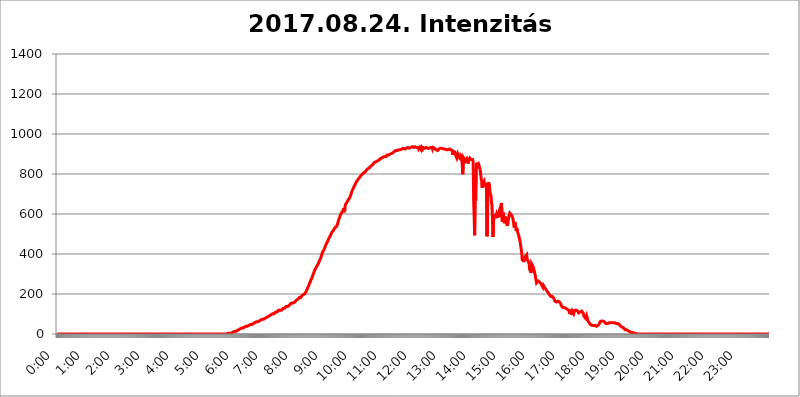
| Category | 2017.08.24. Intenzitás [W/m^2] |
|---|---|
| 0.0 | 0 |
| 0.0006944444444444445 | 0 |
| 0.001388888888888889 | 0 |
| 0.0020833333333333333 | 0 |
| 0.002777777777777778 | 0 |
| 0.003472222222222222 | 0 |
| 0.004166666666666667 | 0 |
| 0.004861111111111111 | 0 |
| 0.005555555555555556 | 0 |
| 0.0062499999999999995 | 0 |
| 0.006944444444444444 | 0 |
| 0.007638888888888889 | 0 |
| 0.008333333333333333 | 0 |
| 0.009027777777777779 | 0 |
| 0.009722222222222222 | 0 |
| 0.010416666666666666 | 0 |
| 0.011111111111111112 | 0 |
| 0.011805555555555555 | 0 |
| 0.012499999999999999 | 0 |
| 0.013194444444444444 | 0 |
| 0.013888888888888888 | 0 |
| 0.014583333333333332 | 0 |
| 0.015277777777777777 | 0 |
| 0.015972222222222224 | 0 |
| 0.016666666666666666 | 0 |
| 0.017361111111111112 | 0 |
| 0.018055555555555557 | 0 |
| 0.01875 | 0 |
| 0.019444444444444445 | 0 |
| 0.02013888888888889 | 0 |
| 0.020833333333333332 | 0 |
| 0.02152777777777778 | 0 |
| 0.022222222222222223 | 0 |
| 0.02291666666666667 | 0 |
| 0.02361111111111111 | 0 |
| 0.024305555555555556 | 0 |
| 0.024999999999999998 | 0 |
| 0.025694444444444447 | 0 |
| 0.02638888888888889 | 0 |
| 0.027083333333333334 | 0 |
| 0.027777777777777776 | 0 |
| 0.02847222222222222 | 0 |
| 0.029166666666666664 | 0 |
| 0.029861111111111113 | 0 |
| 0.030555555555555555 | 0 |
| 0.03125 | 0 |
| 0.03194444444444445 | 0 |
| 0.03263888888888889 | 0 |
| 0.03333333333333333 | 0 |
| 0.034027777777777775 | 0 |
| 0.034722222222222224 | 0 |
| 0.035416666666666666 | 0 |
| 0.036111111111111115 | 0 |
| 0.03680555555555556 | 0 |
| 0.0375 | 0 |
| 0.03819444444444444 | 0 |
| 0.03888888888888889 | 0 |
| 0.03958333333333333 | 0 |
| 0.04027777777777778 | 0 |
| 0.04097222222222222 | 0 |
| 0.041666666666666664 | 0 |
| 0.042361111111111106 | 0 |
| 0.04305555555555556 | 0 |
| 0.043750000000000004 | 0 |
| 0.044444444444444446 | 0 |
| 0.04513888888888889 | 0 |
| 0.04583333333333334 | 0 |
| 0.04652777777777778 | 0 |
| 0.04722222222222222 | 0 |
| 0.04791666666666666 | 0 |
| 0.04861111111111111 | 0 |
| 0.049305555555555554 | 0 |
| 0.049999999999999996 | 0 |
| 0.05069444444444445 | 0 |
| 0.051388888888888894 | 0 |
| 0.052083333333333336 | 0 |
| 0.05277777777777778 | 0 |
| 0.05347222222222222 | 0 |
| 0.05416666666666667 | 0 |
| 0.05486111111111111 | 0 |
| 0.05555555555555555 | 0 |
| 0.05625 | 0 |
| 0.05694444444444444 | 0 |
| 0.057638888888888885 | 0 |
| 0.05833333333333333 | 0 |
| 0.05902777777777778 | 0 |
| 0.059722222222222225 | 0 |
| 0.06041666666666667 | 0 |
| 0.061111111111111116 | 0 |
| 0.06180555555555556 | 0 |
| 0.0625 | 0 |
| 0.06319444444444444 | 0 |
| 0.06388888888888888 | 0 |
| 0.06458333333333334 | 0 |
| 0.06527777777777778 | 0 |
| 0.06597222222222222 | 0 |
| 0.06666666666666667 | 0 |
| 0.06736111111111111 | 0 |
| 0.06805555555555555 | 0 |
| 0.06874999999999999 | 0 |
| 0.06944444444444443 | 0 |
| 0.07013888888888889 | 0 |
| 0.07083333333333333 | 0 |
| 0.07152777777777779 | 0 |
| 0.07222222222222223 | 0 |
| 0.07291666666666667 | 0 |
| 0.07361111111111111 | 0 |
| 0.07430555555555556 | 0 |
| 0.075 | 0 |
| 0.07569444444444444 | 0 |
| 0.0763888888888889 | 0 |
| 0.07708333333333334 | 0 |
| 0.07777777777777778 | 0 |
| 0.07847222222222222 | 0 |
| 0.07916666666666666 | 0 |
| 0.0798611111111111 | 0 |
| 0.08055555555555556 | 0 |
| 0.08125 | 0 |
| 0.08194444444444444 | 0 |
| 0.08263888888888889 | 0 |
| 0.08333333333333333 | 0 |
| 0.08402777777777777 | 0 |
| 0.08472222222222221 | 0 |
| 0.08541666666666665 | 0 |
| 0.08611111111111112 | 0 |
| 0.08680555555555557 | 0 |
| 0.08750000000000001 | 0 |
| 0.08819444444444445 | 0 |
| 0.08888888888888889 | 0 |
| 0.08958333333333333 | 0 |
| 0.09027777777777778 | 0 |
| 0.09097222222222222 | 0 |
| 0.09166666666666667 | 0 |
| 0.09236111111111112 | 0 |
| 0.09305555555555556 | 0 |
| 0.09375 | 0 |
| 0.09444444444444444 | 0 |
| 0.09513888888888888 | 0 |
| 0.09583333333333333 | 0 |
| 0.09652777777777777 | 0 |
| 0.09722222222222222 | 0 |
| 0.09791666666666667 | 0 |
| 0.09861111111111111 | 0 |
| 0.09930555555555555 | 0 |
| 0.09999999999999999 | 0 |
| 0.10069444444444443 | 0 |
| 0.1013888888888889 | 0 |
| 0.10208333333333335 | 0 |
| 0.10277777777777779 | 0 |
| 0.10347222222222223 | 0 |
| 0.10416666666666667 | 0 |
| 0.10486111111111111 | 0 |
| 0.10555555555555556 | 0 |
| 0.10625 | 0 |
| 0.10694444444444444 | 0 |
| 0.1076388888888889 | 0 |
| 0.10833333333333334 | 0 |
| 0.10902777777777778 | 0 |
| 0.10972222222222222 | 0 |
| 0.1111111111111111 | 0 |
| 0.11180555555555556 | 0 |
| 0.11180555555555556 | 0 |
| 0.1125 | 0 |
| 0.11319444444444444 | 0 |
| 0.11388888888888889 | 0 |
| 0.11458333333333333 | 0 |
| 0.11527777777777777 | 0 |
| 0.11597222222222221 | 0 |
| 0.11666666666666665 | 0 |
| 0.1173611111111111 | 0 |
| 0.11805555555555557 | 0 |
| 0.11944444444444445 | 0 |
| 0.12013888888888889 | 0 |
| 0.12083333333333333 | 0 |
| 0.12152777777777778 | 0 |
| 0.12222222222222223 | 0 |
| 0.12291666666666667 | 0 |
| 0.12291666666666667 | 0 |
| 0.12361111111111112 | 0 |
| 0.12430555555555556 | 0 |
| 0.125 | 0 |
| 0.12569444444444444 | 0 |
| 0.12638888888888888 | 0 |
| 0.12708333333333333 | 0 |
| 0.16875 | 0 |
| 0.12847222222222224 | 0 |
| 0.12916666666666668 | 0 |
| 0.12986111111111112 | 0 |
| 0.13055555555555556 | 0 |
| 0.13125 | 0 |
| 0.13194444444444445 | 0 |
| 0.1326388888888889 | 0 |
| 0.13333333333333333 | 0 |
| 0.13402777777777777 | 0 |
| 0.13402777777777777 | 0 |
| 0.13472222222222222 | 0 |
| 0.13541666666666666 | 0 |
| 0.1361111111111111 | 0 |
| 0.13749999999999998 | 0 |
| 0.13819444444444443 | 0 |
| 0.1388888888888889 | 0 |
| 0.13958333333333334 | 0 |
| 0.14027777777777778 | 0 |
| 0.14097222222222222 | 0 |
| 0.14166666666666666 | 0 |
| 0.1423611111111111 | 0 |
| 0.14305555555555557 | 0 |
| 0.14375000000000002 | 0 |
| 0.14444444444444446 | 0 |
| 0.1451388888888889 | 0 |
| 0.1451388888888889 | 0 |
| 0.14652777777777778 | 0 |
| 0.14722222222222223 | 0 |
| 0.14791666666666667 | 0 |
| 0.1486111111111111 | 0 |
| 0.14930555555555555 | 0 |
| 0.15 | 0 |
| 0.15069444444444444 | 0 |
| 0.15138888888888888 | 0 |
| 0.15208333333333332 | 0 |
| 0.15277777777777776 | 0 |
| 0.15347222222222223 | 0 |
| 0.15416666666666667 | 0 |
| 0.15486111111111112 | 0 |
| 0.15555555555555556 | 0 |
| 0.15625 | 0 |
| 0.15694444444444444 | 0 |
| 0.15763888888888888 | 0 |
| 0.15833333333333333 | 0 |
| 0.15902777777777777 | 0 |
| 0.15972222222222224 | 0 |
| 0.16041666666666668 | 0 |
| 0.16111111111111112 | 0 |
| 0.16180555555555556 | 0 |
| 0.1625 | 0 |
| 0.16319444444444445 | 0 |
| 0.1638888888888889 | 0 |
| 0.16458333333333333 | 0 |
| 0.16527777777777777 | 0 |
| 0.16597222222222222 | 0 |
| 0.16666666666666666 | 0 |
| 0.1673611111111111 | 0 |
| 0.16805555555555554 | 0 |
| 0.16874999999999998 | 0 |
| 0.16944444444444443 | 0 |
| 0.17013888888888887 | 0 |
| 0.1708333333333333 | 0 |
| 0.17152777777777775 | 0 |
| 0.17222222222222225 | 0 |
| 0.1729166666666667 | 0 |
| 0.17361111111111113 | 0 |
| 0.17430555555555557 | 0 |
| 0.17500000000000002 | 0 |
| 0.17569444444444446 | 0 |
| 0.1763888888888889 | 0 |
| 0.17708333333333334 | 0 |
| 0.17777777777777778 | 0 |
| 0.17847222222222223 | 0 |
| 0.17916666666666667 | 0 |
| 0.1798611111111111 | 0 |
| 0.18055555555555555 | 0 |
| 0.18125 | 0 |
| 0.18194444444444444 | 0 |
| 0.1826388888888889 | 0 |
| 0.18333333333333335 | 0 |
| 0.1840277777777778 | 0 |
| 0.18472222222222223 | 0 |
| 0.18541666666666667 | 0 |
| 0.18611111111111112 | 0 |
| 0.18680555555555556 | 0 |
| 0.1875 | 0 |
| 0.18819444444444444 | 0 |
| 0.18888888888888888 | 0 |
| 0.18958333333333333 | 0 |
| 0.19027777777777777 | 0 |
| 0.1909722222222222 | 0 |
| 0.19166666666666665 | 0 |
| 0.19236111111111112 | 0 |
| 0.19305555555555554 | 0 |
| 0.19375 | 0 |
| 0.19444444444444445 | 0 |
| 0.1951388888888889 | 0 |
| 0.19583333333333333 | 0 |
| 0.19652777777777777 | 0 |
| 0.19722222222222222 | 0 |
| 0.19791666666666666 | 0 |
| 0.1986111111111111 | 0 |
| 0.19930555555555554 | 0 |
| 0.19999999999999998 | 0 |
| 0.20069444444444443 | 0 |
| 0.20138888888888887 | 0 |
| 0.2020833333333333 | 0 |
| 0.2027777777777778 | 0 |
| 0.2034722222222222 | 0 |
| 0.2041666666666667 | 0 |
| 0.20486111111111113 | 0 |
| 0.20555555555555557 | 0 |
| 0.20625000000000002 | 0 |
| 0.20694444444444446 | 0 |
| 0.2076388888888889 | 0 |
| 0.20833333333333334 | 0 |
| 0.20902777777777778 | 0 |
| 0.20972222222222223 | 0 |
| 0.21041666666666667 | 0 |
| 0.2111111111111111 | 0 |
| 0.21180555555555555 | 0 |
| 0.2125 | 0 |
| 0.21319444444444444 | 0 |
| 0.2138888888888889 | 0 |
| 0.21458333333333335 | 0 |
| 0.2152777777777778 | 0 |
| 0.21597222222222223 | 0 |
| 0.21666666666666667 | 0 |
| 0.21736111111111112 | 0 |
| 0.21805555555555556 | 0 |
| 0.21875 | 0 |
| 0.21944444444444444 | 0 |
| 0.22013888888888888 | 0 |
| 0.22083333333333333 | 0 |
| 0.22152777777777777 | 0 |
| 0.2222222222222222 | 0 |
| 0.22291666666666665 | 0 |
| 0.2236111111111111 | 0 |
| 0.22430555555555556 | 0 |
| 0.225 | 0 |
| 0.22569444444444445 | 0 |
| 0.2263888888888889 | 0 |
| 0.22708333333333333 | 0 |
| 0.22777777777777777 | 0 |
| 0.22847222222222222 | 0 |
| 0.22916666666666666 | 0 |
| 0.2298611111111111 | 0 |
| 0.23055555555555554 | 0 |
| 0.23124999999999998 | 0 |
| 0.23194444444444443 | 0 |
| 0.23263888888888887 | 0 |
| 0.2333333333333333 | 0 |
| 0.2340277777777778 | 0 |
| 0.2347222222222222 | 0 |
| 0.2354166666666667 | 0 |
| 0.23611111111111113 | 0 |
| 0.23680555555555557 | 0 |
| 0.23750000000000002 | 0 |
| 0.23819444444444446 | 0 |
| 0.2388888888888889 | 0 |
| 0.23958333333333334 | 3.525 |
| 0.24027777777777778 | 3.525 |
| 0.24097222222222223 | 3.525 |
| 0.24166666666666667 | 3.525 |
| 0.2423611111111111 | 3.525 |
| 0.24305555555555555 | 3.525 |
| 0.24375 | 3.525 |
| 0.24444444444444446 | 3.525 |
| 0.24513888888888888 | 7.887 |
| 0.24583333333333335 | 7.887 |
| 0.2465277777777778 | 7.887 |
| 0.24722222222222223 | 7.887 |
| 0.24791666666666667 | 12.257 |
| 0.24861111111111112 | 12.257 |
| 0.24930555555555556 | 12.257 |
| 0.25 | 12.257 |
| 0.25069444444444444 | 12.257 |
| 0.2513888888888889 | 16.636 |
| 0.2520833333333333 | 16.636 |
| 0.25277777777777777 | 16.636 |
| 0.2534722222222222 | 16.636 |
| 0.25416666666666665 | 21.024 |
| 0.2548611111111111 | 21.024 |
| 0.2555555555555556 | 21.024 |
| 0.25625000000000003 | 25.419 |
| 0.2569444444444445 | 25.419 |
| 0.2576388888888889 | 25.419 |
| 0.25833333333333336 | 29.823 |
| 0.2590277777777778 | 29.823 |
| 0.25972222222222224 | 29.823 |
| 0.2604166666666667 | 29.823 |
| 0.2611111111111111 | 29.823 |
| 0.26180555555555557 | 34.234 |
| 0.2625 | 34.234 |
| 0.26319444444444445 | 34.234 |
| 0.2638888888888889 | 38.653 |
| 0.26458333333333334 | 38.653 |
| 0.2652777777777778 | 38.653 |
| 0.2659722222222222 | 38.653 |
| 0.26666666666666666 | 38.653 |
| 0.2673611111111111 | 43.079 |
| 0.26805555555555555 | 43.079 |
| 0.26875 | 43.079 |
| 0.26944444444444443 | 43.079 |
| 0.2701388888888889 | 47.511 |
| 0.2708333333333333 | 47.511 |
| 0.27152777777777776 | 47.511 |
| 0.2722222222222222 | 47.511 |
| 0.27291666666666664 | 47.511 |
| 0.2736111111111111 | 51.951 |
| 0.2743055555555555 | 51.951 |
| 0.27499999999999997 | 51.951 |
| 0.27569444444444446 | 56.398 |
| 0.27638888888888885 | 56.398 |
| 0.27708333333333335 | 56.398 |
| 0.2777777777777778 | 56.398 |
| 0.27847222222222223 | 60.85 |
| 0.2791666666666667 | 60.85 |
| 0.2798611111111111 | 60.85 |
| 0.28055555555555556 | 60.85 |
| 0.28125 | 60.85 |
| 0.28194444444444444 | 65.31 |
| 0.2826388888888889 | 65.31 |
| 0.2833333333333333 | 65.31 |
| 0.28402777777777777 | 65.31 |
| 0.2847222222222222 | 69.775 |
| 0.28541666666666665 | 69.775 |
| 0.28611111111111115 | 69.775 |
| 0.28680555555555554 | 69.775 |
| 0.28750000000000003 | 74.246 |
| 0.2881944444444445 | 74.246 |
| 0.2888888888888889 | 74.246 |
| 0.28958333333333336 | 74.246 |
| 0.2902777777777778 | 74.246 |
| 0.29097222222222224 | 78.722 |
| 0.2916666666666667 | 78.722 |
| 0.2923611111111111 | 83.205 |
| 0.29305555555555557 | 83.205 |
| 0.29375 | 83.205 |
| 0.29444444444444445 | 83.205 |
| 0.2951388888888889 | 83.205 |
| 0.29583333333333334 | 87.692 |
| 0.2965277777777778 | 87.692 |
| 0.2972222222222222 | 87.692 |
| 0.29791666666666666 | 92.184 |
| 0.2986111111111111 | 92.184 |
| 0.29930555555555555 | 92.184 |
| 0.3 | 96.682 |
| 0.30069444444444443 | 96.682 |
| 0.3013888888888889 | 96.682 |
| 0.3020833333333333 | 101.184 |
| 0.30277777777777776 | 101.184 |
| 0.3034722222222222 | 101.184 |
| 0.30416666666666664 | 101.184 |
| 0.3048611111111111 | 105.69 |
| 0.3055555555555555 | 105.69 |
| 0.30624999999999997 | 110.201 |
| 0.3069444444444444 | 110.201 |
| 0.3076388888888889 | 110.201 |
| 0.30833333333333335 | 110.201 |
| 0.3090277777777778 | 114.716 |
| 0.30972222222222223 | 114.716 |
| 0.3104166666666667 | 119.235 |
| 0.3111111111111111 | 119.235 |
| 0.31180555555555556 | 119.235 |
| 0.3125 | 119.235 |
| 0.31319444444444444 | 119.235 |
| 0.3138888888888889 | 119.235 |
| 0.3145833333333333 | 119.235 |
| 0.31527777777777777 | 123.758 |
| 0.3159722222222222 | 123.758 |
| 0.31666666666666665 | 128.284 |
| 0.31736111111111115 | 128.284 |
| 0.31805555555555554 | 128.284 |
| 0.31875000000000003 | 128.284 |
| 0.3194444444444445 | 128.284 |
| 0.3201388888888889 | 128.284 |
| 0.32083333333333336 | 137.347 |
| 0.3215277777777778 | 132.814 |
| 0.32222222222222224 | 137.347 |
| 0.3229166666666667 | 137.347 |
| 0.3236111111111111 | 141.884 |
| 0.32430555555555557 | 141.884 |
| 0.325 | 141.884 |
| 0.32569444444444445 | 146.423 |
| 0.3263888888888889 | 146.423 |
| 0.32708333333333334 | 150.964 |
| 0.3277777777777778 | 150.964 |
| 0.3284722222222222 | 155.509 |
| 0.32916666666666666 | 155.509 |
| 0.3298611111111111 | 155.509 |
| 0.33055555555555555 | 155.509 |
| 0.33125 | 155.509 |
| 0.33194444444444443 | 155.509 |
| 0.3326388888888889 | 155.509 |
| 0.3333333333333333 | 160.056 |
| 0.3340277777777778 | 164.605 |
| 0.3347222222222222 | 164.605 |
| 0.3354166666666667 | 169.156 |
| 0.3361111111111111 | 169.156 |
| 0.3368055555555556 | 173.709 |
| 0.33749999999999997 | 173.709 |
| 0.33819444444444446 | 178.264 |
| 0.33888888888888885 | 178.264 |
| 0.33958333333333335 | 182.82 |
| 0.34027777777777773 | 182.82 |
| 0.34097222222222223 | 182.82 |
| 0.3416666666666666 | 182.82 |
| 0.3423611111111111 | 187.378 |
| 0.3430555555555555 | 191.937 |
| 0.34375 | 191.937 |
| 0.3444444444444445 | 196.497 |
| 0.3451388888888889 | 196.497 |
| 0.3458333333333334 | 196.497 |
| 0.34652777777777777 | 196.497 |
| 0.34722222222222227 | 201.058 |
| 0.34791666666666665 | 201.058 |
| 0.34861111111111115 | 210.182 |
| 0.34930555555555554 | 214.746 |
| 0.35000000000000003 | 219.309 |
| 0.3506944444444444 | 223.873 |
| 0.3513888888888889 | 233 |
| 0.3520833333333333 | 237.564 |
| 0.3527777777777778 | 242.127 |
| 0.3534722222222222 | 251.251 |
| 0.3541666666666667 | 255.813 |
| 0.3548611111111111 | 260.373 |
| 0.35555555555555557 | 269.49 |
| 0.35625 | 274.047 |
| 0.35694444444444445 | 278.603 |
| 0.3576388888888889 | 283.156 |
| 0.35833333333333334 | 292.259 |
| 0.3590277777777778 | 296.808 |
| 0.3597222222222222 | 305.898 |
| 0.36041666666666666 | 310.44 |
| 0.3611111111111111 | 319.517 |
| 0.36180555555555555 | 319.517 |
| 0.3625 | 328.584 |
| 0.36319444444444443 | 333.113 |
| 0.3638888888888889 | 337.639 |
| 0.3645833333333333 | 337.639 |
| 0.3652777777777778 | 346.682 |
| 0.3659722222222222 | 351.198 |
| 0.3666666666666667 | 355.712 |
| 0.3673611111111111 | 360.221 |
| 0.3680555555555556 | 369.23 |
| 0.36874999999999997 | 373.729 |
| 0.36944444444444446 | 378.224 |
| 0.37013888888888885 | 387.202 |
| 0.37083333333333335 | 396.164 |
| 0.37152777777777773 | 400.638 |
| 0.37222222222222223 | 409.574 |
| 0.3729166666666666 | 405.108 |
| 0.3736111111111111 | 414.035 |
| 0.3743055555555555 | 422.943 |
| 0.375 | 427.39 |
| 0.3756944444444445 | 436.27 |
| 0.3763888888888889 | 440.702 |
| 0.3770833333333334 | 449.551 |
| 0.37777777777777777 | 453.968 |
| 0.37847222222222227 | 458.38 |
| 0.37916666666666665 | 462.786 |
| 0.37986111111111115 | 467.187 |
| 0.38055555555555554 | 475.972 |
| 0.38125000000000003 | 480.356 |
| 0.3819444444444444 | 484.735 |
| 0.3826388888888889 | 489.108 |
| 0.3833333333333333 | 493.475 |
| 0.3840277777777778 | 497.836 |
| 0.3847222222222222 | 506.542 |
| 0.3854166666666667 | 506.542 |
| 0.3861111111111111 | 510.885 |
| 0.38680555555555557 | 515.223 |
| 0.3875 | 519.555 |
| 0.38819444444444445 | 523.88 |
| 0.3888888888888889 | 523.88 |
| 0.38958333333333334 | 532.513 |
| 0.3902777777777778 | 532.513 |
| 0.3909722222222222 | 536.82 |
| 0.39166666666666666 | 536.82 |
| 0.3923611111111111 | 541.121 |
| 0.39305555555555555 | 549.704 |
| 0.39375 | 558.261 |
| 0.39444444444444443 | 566.793 |
| 0.3951388888888889 | 575.299 |
| 0.3958333333333333 | 579.542 |
| 0.3965277777777778 | 588.009 |
| 0.3972222222222222 | 592.233 |
| 0.3979166666666667 | 600.661 |
| 0.3986111111111111 | 596.45 |
| 0.3993055555555556 | 609.062 |
| 0.39999999999999997 | 609.062 |
| 0.40069444444444446 | 613.252 |
| 0.40138888888888885 | 621.613 |
| 0.40208333333333335 | 629.948 |
| 0.40277777777777773 | 609.062 |
| 0.40347222222222223 | 629.948 |
| 0.4041666666666666 | 646.537 |
| 0.4048611111111111 | 650.667 |
| 0.4055555555555555 | 654.791 |
| 0.40625 | 658.909 |
| 0.4069444444444445 | 663.019 |
| 0.4076388888888889 | 663.019 |
| 0.4083333333333334 | 667.123 |
| 0.40902777777777777 | 675.311 |
| 0.40972222222222227 | 679.395 |
| 0.41041666666666665 | 683.473 |
| 0.41111111111111115 | 691.608 |
| 0.41180555555555554 | 695.666 |
| 0.41250000000000003 | 703.762 |
| 0.4131944444444444 | 711.832 |
| 0.4138888888888889 | 715.858 |
| 0.4145833333333333 | 723.889 |
| 0.4152777777777778 | 727.896 |
| 0.4159722222222222 | 735.89 |
| 0.4166666666666667 | 739.877 |
| 0.4173611111111111 | 743.859 |
| 0.41805555555555557 | 747.834 |
| 0.41875 | 755.766 |
| 0.41944444444444445 | 759.723 |
| 0.4201388888888889 | 763.674 |
| 0.42083333333333334 | 767.62 |
| 0.4215277777777778 | 767.62 |
| 0.4222222222222222 | 775.492 |
| 0.42291666666666666 | 775.492 |
| 0.4236111111111111 | 779.42 |
| 0.42430555555555555 | 783.342 |
| 0.425 | 787.258 |
| 0.42569444444444443 | 791.169 |
| 0.4263888888888889 | 791.169 |
| 0.4270833333333333 | 795.074 |
| 0.4277777777777778 | 798.974 |
| 0.4284722222222222 | 802.868 |
| 0.4291666666666667 | 802.868 |
| 0.4298611111111111 | 806.757 |
| 0.4305555555555556 | 806.757 |
| 0.43124999999999997 | 810.641 |
| 0.43194444444444446 | 810.641 |
| 0.43263888888888885 | 814.519 |
| 0.43333333333333335 | 818.392 |
| 0.43402777777777773 | 822.26 |
| 0.43472222222222223 | 822.26 |
| 0.4354166666666666 | 826.123 |
| 0.4361111111111111 | 826.123 |
| 0.4368055555555555 | 829.981 |
| 0.4375 | 829.981 |
| 0.4381944444444445 | 833.834 |
| 0.4388888888888889 | 837.682 |
| 0.4395833333333334 | 837.682 |
| 0.44027777777777777 | 841.526 |
| 0.44097222222222227 | 841.526 |
| 0.44166666666666665 | 845.365 |
| 0.44236111111111115 | 845.365 |
| 0.44305555555555554 | 849.199 |
| 0.44375000000000003 | 853.029 |
| 0.4444444444444444 | 856.855 |
| 0.4451388888888889 | 856.855 |
| 0.4458333333333333 | 860.676 |
| 0.4465277777777778 | 860.676 |
| 0.4472222222222222 | 860.676 |
| 0.4479166666666667 | 864.493 |
| 0.4486111111111111 | 864.493 |
| 0.44930555555555557 | 868.305 |
| 0.45 | 868.305 |
| 0.45069444444444445 | 868.305 |
| 0.4513888888888889 | 868.305 |
| 0.45208333333333334 | 872.114 |
| 0.4527777777777778 | 875.918 |
| 0.4534722222222222 | 875.918 |
| 0.45416666666666666 | 875.918 |
| 0.4548611111111111 | 879.719 |
| 0.45555555555555555 | 883.516 |
| 0.45625 | 883.516 |
| 0.45694444444444443 | 883.516 |
| 0.4576388888888889 | 887.309 |
| 0.4583333333333333 | 887.309 |
| 0.4590277777777778 | 887.309 |
| 0.4597222222222222 | 887.309 |
| 0.4604166666666667 | 887.309 |
| 0.4611111111111111 | 887.309 |
| 0.4618055555555556 | 891.099 |
| 0.46249999999999997 | 894.885 |
| 0.46319444444444446 | 894.885 |
| 0.46388888888888885 | 894.885 |
| 0.46458333333333335 | 894.885 |
| 0.46527777777777773 | 898.668 |
| 0.46597222222222223 | 898.668 |
| 0.4666666666666666 | 898.668 |
| 0.4673611111111111 | 902.447 |
| 0.4680555555555555 | 902.447 |
| 0.46875 | 902.447 |
| 0.4694444444444445 | 902.447 |
| 0.4701388888888889 | 906.223 |
| 0.4708333333333334 | 906.223 |
| 0.47152777777777777 | 909.996 |
| 0.47222222222222227 | 909.996 |
| 0.47291666666666665 | 913.766 |
| 0.47361111111111115 | 917.534 |
| 0.47430555555555554 | 913.766 |
| 0.47500000000000003 | 917.534 |
| 0.4756944444444444 | 917.534 |
| 0.4763888888888889 | 917.534 |
| 0.4770833333333333 | 917.534 |
| 0.4777777777777778 | 921.298 |
| 0.4784722222222222 | 921.298 |
| 0.4791666666666667 | 921.298 |
| 0.4798611111111111 | 921.298 |
| 0.48055555555555557 | 921.298 |
| 0.48125 | 921.298 |
| 0.48194444444444445 | 925.06 |
| 0.4826388888888889 | 925.06 |
| 0.48333333333333334 | 925.06 |
| 0.4840277777777778 | 925.06 |
| 0.4847222222222222 | 925.06 |
| 0.48541666666666666 | 928.819 |
| 0.4861111111111111 | 925.06 |
| 0.48680555555555555 | 928.819 |
| 0.4875 | 925.06 |
| 0.48819444444444443 | 928.819 |
| 0.4888888888888889 | 925.06 |
| 0.4895833333333333 | 928.819 |
| 0.4902777777777778 | 928.819 |
| 0.4909722222222222 | 932.576 |
| 0.4916666666666667 | 932.576 |
| 0.4923611111111111 | 932.576 |
| 0.4930555555555556 | 932.576 |
| 0.49374999999999997 | 928.819 |
| 0.49444444444444446 | 932.576 |
| 0.49513888888888885 | 928.819 |
| 0.49583333333333335 | 932.576 |
| 0.49652777777777773 | 932.576 |
| 0.49722222222222223 | 932.576 |
| 0.4979166666666666 | 936.33 |
| 0.4986111111111111 | 932.576 |
| 0.4993055555555555 | 932.576 |
| 0.5 | 932.576 |
| 0.5006944444444444 | 932.576 |
| 0.5013888888888889 | 932.576 |
| 0.5020833333333333 | 936.33 |
| 0.5027777777777778 | 936.33 |
| 0.5034722222222222 | 936.33 |
| 0.5041666666666667 | 932.576 |
| 0.5048611111111111 | 932.576 |
| 0.5055555555555555 | 932.576 |
| 0.50625 | 932.576 |
| 0.5069444444444444 | 925.06 |
| 0.5076388888888889 | 928.819 |
| 0.5083333333333333 | 932.576 |
| 0.5090277777777777 | 928.819 |
| 0.5097222222222222 | 932.576 |
| 0.5104166666666666 | 921.298 |
| 0.5111111111111112 | 932.576 |
| 0.5118055555555555 | 932.576 |
| 0.5125000000000001 | 925.06 |
| 0.5131944444444444 | 932.576 |
| 0.513888888888889 | 928.819 |
| 0.5145833333333333 | 928.819 |
| 0.5152777777777778 | 928.819 |
| 0.5159722222222222 | 928.819 |
| 0.5166666666666667 | 928.819 |
| 0.517361111111111 | 932.576 |
| 0.5180555555555556 | 932.576 |
| 0.5187499999999999 | 928.819 |
| 0.5194444444444445 | 928.819 |
| 0.5201388888888888 | 928.819 |
| 0.5208333333333334 | 925.06 |
| 0.5215277777777778 | 928.819 |
| 0.5222222222222223 | 925.06 |
| 0.5229166666666667 | 928.819 |
| 0.5236111111111111 | 932.576 |
| 0.5243055555555556 | 932.576 |
| 0.525 | 932.576 |
| 0.5256944444444445 | 932.576 |
| 0.5263888888888889 | 925.06 |
| 0.5270833333333333 | 932.576 |
| 0.5277777777777778 | 928.819 |
| 0.5284722222222222 | 928.819 |
| 0.5291666666666667 | 928.819 |
| 0.5298611111111111 | 932.576 |
| 0.5305555555555556 | 928.819 |
| 0.53125 | 921.298 |
| 0.5319444444444444 | 921.298 |
| 0.5326388888888889 | 921.298 |
| 0.5333333333333333 | 917.534 |
| 0.5340277777777778 | 917.534 |
| 0.5347222222222222 | 921.298 |
| 0.5354166666666667 | 925.06 |
| 0.5361111111111111 | 925.06 |
| 0.5368055555555555 | 928.819 |
| 0.5375 | 928.819 |
| 0.5381944444444444 | 928.819 |
| 0.5388888888888889 | 928.819 |
| 0.5395833333333333 | 928.819 |
| 0.5402777777777777 | 925.06 |
| 0.5409722222222222 | 925.06 |
| 0.5416666666666666 | 925.06 |
| 0.5423611111111112 | 925.06 |
| 0.5430555555555555 | 925.06 |
| 0.5437500000000001 | 925.06 |
| 0.5444444444444444 | 921.298 |
| 0.545138888888889 | 925.06 |
| 0.5458333333333333 | 921.298 |
| 0.5465277777777778 | 921.298 |
| 0.5472222222222222 | 925.06 |
| 0.5479166666666667 | 921.298 |
| 0.548611111111111 | 925.06 |
| 0.5493055555555556 | 925.06 |
| 0.5499999999999999 | 925.06 |
| 0.5506944444444445 | 925.06 |
| 0.5513888888888888 | 925.06 |
| 0.5520833333333334 | 921.298 |
| 0.5527777777777778 | 921.298 |
| 0.5534722222222223 | 917.534 |
| 0.5541666666666667 | 913.766 |
| 0.5548611111111111 | 894.885 |
| 0.5555555555555556 | 913.766 |
| 0.55625 | 913.766 |
| 0.5569444444444445 | 913.766 |
| 0.5576388888888889 | 909.996 |
| 0.5583333333333333 | 898.668 |
| 0.5590277777777778 | 891.099 |
| 0.5597222222222222 | 894.885 |
| 0.5604166666666667 | 879.719 |
| 0.5611111111111111 | 883.516 |
| 0.5618055555555556 | 898.668 |
| 0.5625 | 894.885 |
| 0.5631944444444444 | 883.516 |
| 0.5638888888888889 | 887.309 |
| 0.5645833333333333 | 883.516 |
| 0.5652777777777778 | 875.918 |
| 0.5659722222222222 | 891.099 |
| 0.5666666666666667 | 887.309 |
| 0.5673611111111111 | 883.516 |
| 0.5680555555555555 | 887.309 |
| 0.56875 | 798.974 |
| 0.5694444444444444 | 883.516 |
| 0.5701388888888889 | 883.516 |
| 0.5708333333333333 | 883.516 |
| 0.5715277777777777 | 872.114 |
| 0.5722222222222222 | 864.493 |
| 0.5729166666666666 | 868.305 |
| 0.5736111111111112 | 864.493 |
| 0.5743055555555555 | 875.918 |
| 0.5750000000000001 | 868.305 |
| 0.5756944444444444 | 872.114 |
| 0.576388888888889 | 853.029 |
| 0.5770833333333333 | 868.305 |
| 0.5777777777777778 | 872.114 |
| 0.5784722222222222 | 879.719 |
| 0.5791666666666667 | 879.719 |
| 0.579861111111111 | 875.918 |
| 0.5805555555555556 | 872.114 |
| 0.5812499999999999 | 875.918 |
| 0.5819444444444445 | 875.918 |
| 0.5826388888888888 | 872.114 |
| 0.5833333333333334 | 860.676 |
| 0.5840277777777778 | 663.019 |
| 0.5847222222222223 | 588.009 |
| 0.5854166666666667 | 493.475 |
| 0.5861111111111111 | 751.803 |
| 0.5868055555555556 | 667.123 |
| 0.5875 | 833.834 |
| 0.5881944444444445 | 849.199 |
| 0.5888888888888889 | 856.855 |
| 0.5895833333333333 | 841.526 |
| 0.5902777777777778 | 837.682 |
| 0.5909722222222222 | 849.199 |
| 0.5916666666666667 | 849.199 |
| 0.5923611111111111 | 833.834 |
| 0.5930555555555556 | 829.981 |
| 0.59375 | 806.757 |
| 0.5944444444444444 | 779.42 |
| 0.5951388888888889 | 767.62 |
| 0.5958333333333333 | 731.896 |
| 0.5965277777777778 | 727.896 |
| 0.5972222222222222 | 755.766 |
| 0.5979166666666667 | 759.723 |
| 0.5986111111111111 | 763.674 |
| 0.5993055555555555 | 735.89 |
| 0.6 | 755.766 |
| 0.6006944444444444 | 743.859 |
| 0.6013888888888889 | 735.89 |
| 0.6020833333333333 | 743.859 |
| 0.6027777777777777 | 489.108 |
| 0.6034722222222222 | 600.661 |
| 0.6041666666666666 | 743.859 |
| 0.6048611111111112 | 759.723 |
| 0.6055555555555555 | 759.723 |
| 0.6062500000000001 | 735.89 |
| 0.6069444444444444 | 703.762 |
| 0.607638888888889 | 699.717 |
| 0.6083333333333333 | 691.608 |
| 0.6090277777777778 | 658.909 |
| 0.6097222222222222 | 642.4 |
| 0.6104166666666667 | 579.542 |
| 0.611111111111111 | 484.735 |
| 0.6118055555555556 | 558.261 |
| 0.6124999999999999 | 583.779 |
| 0.6131944444444445 | 583.779 |
| 0.6138888888888888 | 600.661 |
| 0.6145833333333334 | 600.661 |
| 0.6152777777777778 | 579.542 |
| 0.6159722222222223 | 583.779 |
| 0.6166666666666667 | 604.864 |
| 0.6173611111111111 | 600.661 |
| 0.6180555555555556 | 596.45 |
| 0.61875 | 604.864 |
| 0.6194444444444445 | 592.233 |
| 0.6201388888888889 | 583.779 |
| 0.6208333333333333 | 625.784 |
| 0.6215277777777778 | 634.105 |
| 0.6222222222222222 | 642.4 |
| 0.6229166666666667 | 654.791 |
| 0.6236111111111111 | 658.909 |
| 0.6243055555555556 | 562.53 |
| 0.625 | 609.062 |
| 0.6256944444444444 | 609.062 |
| 0.6263888888888889 | 583.779 |
| 0.6270833333333333 | 553.986 |
| 0.6277777777777778 | 588.009 |
| 0.6284722222222222 | 592.233 |
| 0.6291666666666667 | 583.779 |
| 0.6298611111111111 | 558.261 |
| 0.6305555555555555 | 549.704 |
| 0.63125 | 541.121 |
| 0.6319444444444444 | 553.986 |
| 0.6326388888888889 | 571.049 |
| 0.6333333333333333 | 588.009 |
| 0.6340277777777777 | 592.233 |
| 0.6347222222222222 | 604.864 |
| 0.6354166666666666 | 609.062 |
| 0.6361111111111112 | 600.661 |
| 0.6368055555555555 | 596.45 |
| 0.6375000000000001 | 596.45 |
| 0.6381944444444444 | 592.233 |
| 0.638888888888889 | 579.542 |
| 0.6395833333333333 | 566.793 |
| 0.6402777777777778 | 549.704 |
| 0.6409722222222222 | 532.513 |
| 0.6416666666666667 | 558.261 |
| 0.642361111111111 | 549.704 |
| 0.6430555555555556 | 541.121 |
| 0.6437499999999999 | 515.223 |
| 0.6444444444444445 | 528.2 |
| 0.6451388888888888 | 519.555 |
| 0.6458333333333334 | 506.542 |
| 0.6465277777777778 | 510.885 |
| 0.6472222222222223 | 493.475 |
| 0.6479166666666667 | 480.356 |
| 0.6486111111111111 | 471.582 |
| 0.6493055555555556 | 458.38 |
| 0.65 | 440.702 |
| 0.6506944444444445 | 422.943 |
| 0.6513888888888889 | 409.574 |
| 0.6520833333333333 | 373.729 |
| 0.6527777777777778 | 364.728 |
| 0.6534722222222222 | 378.224 |
| 0.6541666666666667 | 360.221 |
| 0.6548611111111111 | 364.728 |
| 0.6555555555555556 | 355.712 |
| 0.65625 | 387.202 |
| 0.6569444444444444 | 382.715 |
| 0.6576388888888889 | 391.685 |
| 0.6583333333333333 | 396.164 |
| 0.6590277777777778 | 373.729 |
| 0.6597222222222222 | 373.729 |
| 0.6604166666666667 | 364.728 |
| 0.6611111111111111 | 360.221 |
| 0.6618055555555555 | 351.198 |
| 0.6625 | 324.052 |
| 0.6631944444444444 | 328.584 |
| 0.6638888888888889 | 319.517 |
| 0.6645833333333333 | 305.898 |
| 0.6652777777777777 | 351.198 |
| 0.6659722222222222 | 346.682 |
| 0.6666666666666666 | 342.162 |
| 0.6673611111111111 | 337.639 |
| 0.6680555555555556 | 328.584 |
| 0.6687500000000001 | 319.517 |
| 0.6694444444444444 | 319.517 |
| 0.6701388888888888 | 296.808 |
| 0.6708333333333334 | 301.354 |
| 0.6715277777777778 | 269.49 |
| 0.6722222222222222 | 255.813 |
| 0.6729166666666666 | 255.813 |
| 0.6736111111111112 | 251.251 |
| 0.6743055555555556 | 264.932 |
| 0.6749999999999999 | 264.932 |
| 0.6756944444444444 | 260.373 |
| 0.6763888888888889 | 260.373 |
| 0.6770833333333334 | 260.373 |
| 0.6777777777777777 | 260.373 |
| 0.6784722222222223 | 251.251 |
| 0.6791666666666667 | 251.251 |
| 0.6798611111111111 | 242.127 |
| 0.6805555555555555 | 242.127 |
| 0.68125 | 233 |
| 0.6819444444444445 | 242.127 |
| 0.6826388888888889 | 237.564 |
| 0.6833333333333332 | 233 |
| 0.6840277777777778 | 233 |
| 0.6847222222222222 | 228.436 |
| 0.6854166666666667 | 223.873 |
| 0.686111111111111 | 219.309 |
| 0.6868055555555556 | 214.746 |
| 0.6875 | 210.182 |
| 0.6881944444444444 | 210.182 |
| 0.688888888888889 | 205.62 |
| 0.6895833333333333 | 201.058 |
| 0.6902777777777778 | 196.497 |
| 0.6909722222222222 | 191.937 |
| 0.6916666666666668 | 191.937 |
| 0.6923611111111111 | 187.378 |
| 0.6930555555555555 | 191.937 |
| 0.69375 | 191.937 |
| 0.6944444444444445 | 187.378 |
| 0.6951388888888889 | 187.378 |
| 0.6958333333333333 | 182.82 |
| 0.6965277777777777 | 178.264 |
| 0.6972222222222223 | 173.709 |
| 0.6979166666666666 | 164.605 |
| 0.6986111111111111 | 164.605 |
| 0.6993055555555556 | 160.056 |
| 0.7000000000000001 | 160.056 |
| 0.7006944444444444 | 164.605 |
| 0.7013888888888888 | 164.605 |
| 0.7020833333333334 | 164.605 |
| 0.7027777777777778 | 164.605 |
| 0.7034722222222222 | 160.056 |
| 0.7041666666666666 | 160.056 |
| 0.7048611111111112 | 155.509 |
| 0.7055555555555556 | 155.509 |
| 0.7062499999999999 | 150.964 |
| 0.7069444444444444 | 141.884 |
| 0.7076388888888889 | 141.884 |
| 0.7083333333333334 | 137.347 |
| 0.7090277777777777 | 132.814 |
| 0.7097222222222223 | 132.814 |
| 0.7104166666666667 | 132.814 |
| 0.7111111111111111 | 132.814 |
| 0.7118055555555555 | 132.814 |
| 0.7125 | 132.814 |
| 0.7131944444444445 | 128.284 |
| 0.7138888888888889 | 128.284 |
| 0.7145833333333332 | 128.284 |
| 0.7152777777777778 | 123.758 |
| 0.7159722222222222 | 119.235 |
| 0.7166666666666667 | 119.235 |
| 0.717361111111111 | 119.235 |
| 0.7180555555555556 | 110.201 |
| 0.71875 | 110.201 |
| 0.7194444444444444 | 114.716 |
| 0.720138888888889 | 114.716 |
| 0.7208333333333333 | 96.682 |
| 0.7215277777777778 | 105.69 |
| 0.7222222222222222 | 114.716 |
| 0.7229166666666668 | 110.201 |
| 0.7236111111111111 | 119.235 |
| 0.7243055555555555 | 101.184 |
| 0.725 | 101.184 |
| 0.7256944444444445 | 119.235 |
| 0.7263888888888889 | 119.235 |
| 0.7270833333333333 | 119.235 |
| 0.7277777777777777 | 119.235 |
| 0.7284722222222223 | 114.716 |
| 0.7291666666666666 | 119.235 |
| 0.7298611111111111 | 114.716 |
| 0.7305555555555556 | 110.201 |
| 0.7312500000000001 | 105.69 |
| 0.7319444444444444 | 110.201 |
| 0.7326388888888888 | 110.201 |
| 0.7333333333333334 | 110.201 |
| 0.7340277777777778 | 110.201 |
| 0.7347222222222222 | 110.201 |
| 0.7354166666666666 | 114.716 |
| 0.7361111111111112 | 110.201 |
| 0.7368055555555556 | 110.201 |
| 0.7374999999999999 | 105.69 |
| 0.7381944444444444 | 101.184 |
| 0.7388888888888889 | 87.692 |
| 0.7395833333333334 | 83.205 |
| 0.7402777777777777 | 83.205 |
| 0.7409722222222223 | 78.722 |
| 0.7416666666666667 | 83.205 |
| 0.7423611111111111 | 92.184 |
| 0.7430555555555555 | 87.692 |
| 0.74375 | 74.246 |
| 0.7444444444444445 | 65.31 |
| 0.7451388888888889 | 60.85 |
| 0.7458333333333332 | 56.398 |
| 0.7465277777777778 | 51.951 |
| 0.7472222222222222 | 51.951 |
| 0.7479166666666667 | 47.511 |
| 0.748611111111111 | 47.511 |
| 0.7493055555555556 | 47.511 |
| 0.75 | 43.079 |
| 0.7506944444444444 | 43.079 |
| 0.751388888888889 | 43.079 |
| 0.7520833333333333 | 43.079 |
| 0.7527777777777778 | 43.079 |
| 0.7534722222222222 | 43.079 |
| 0.7541666666666668 | 43.079 |
| 0.7548611111111111 | 43.079 |
| 0.7555555555555555 | 38.653 |
| 0.75625 | 38.653 |
| 0.7569444444444445 | 43.079 |
| 0.7576388888888889 | 43.079 |
| 0.7583333333333333 | 43.079 |
| 0.7590277777777777 | 43.079 |
| 0.7597222222222223 | 47.511 |
| 0.7604166666666666 | 51.951 |
| 0.7611111111111111 | 60.85 |
| 0.7618055555555556 | 60.85 |
| 0.7625000000000001 | 65.31 |
| 0.7631944444444444 | 65.31 |
| 0.7638888888888888 | 65.31 |
| 0.7645833333333334 | 65.31 |
| 0.7652777777777778 | 65.31 |
| 0.7659722222222222 | 60.85 |
| 0.7666666666666666 | 60.85 |
| 0.7673611111111112 | 60.85 |
| 0.7680555555555556 | 56.398 |
| 0.7687499999999999 | 56.398 |
| 0.7694444444444444 | 51.951 |
| 0.7701388888888889 | 51.951 |
| 0.7708333333333334 | 51.951 |
| 0.7715277777777777 | 51.951 |
| 0.7722222222222223 | 56.398 |
| 0.7729166666666667 | 56.398 |
| 0.7736111111111111 | 56.398 |
| 0.7743055555555555 | 60.85 |
| 0.775 | 60.85 |
| 0.7756944444444445 | 56.398 |
| 0.7763888888888889 | 60.85 |
| 0.7770833333333332 | 56.398 |
| 0.7777777777777778 | 56.398 |
| 0.7784722222222222 | 56.398 |
| 0.7791666666666667 | 56.398 |
| 0.779861111111111 | 56.398 |
| 0.7805555555555556 | 56.398 |
| 0.78125 | 56.398 |
| 0.7819444444444444 | 56.398 |
| 0.782638888888889 | 51.951 |
| 0.7833333333333333 | 51.951 |
| 0.7840277777777778 | 51.951 |
| 0.7847222222222222 | 51.951 |
| 0.7854166666666668 | 51.951 |
| 0.7861111111111111 | 51.951 |
| 0.7868055555555555 | 47.511 |
| 0.7875 | 47.511 |
| 0.7881944444444445 | 47.511 |
| 0.7888888888888889 | 43.079 |
| 0.7895833333333333 | 43.079 |
| 0.7902777777777777 | 38.653 |
| 0.7909722222222223 | 38.653 |
| 0.7916666666666666 | 38.653 |
| 0.7923611111111111 | 34.234 |
| 0.7930555555555556 | 29.823 |
| 0.7937500000000001 | 29.823 |
| 0.7944444444444444 | 29.823 |
| 0.7951388888888888 | 25.419 |
| 0.7958333333333334 | 25.419 |
| 0.7965277777777778 | 21.024 |
| 0.7972222222222222 | 21.024 |
| 0.7979166666666666 | 21.024 |
| 0.7986111111111112 | 21.024 |
| 0.7993055555555556 | 16.636 |
| 0.7999999999999999 | 16.636 |
| 0.8006944444444444 | 16.636 |
| 0.8013888888888889 | 12.257 |
| 0.8020833333333334 | 12.257 |
| 0.8027777777777777 | 12.257 |
| 0.8034722222222223 | 12.257 |
| 0.8041666666666667 | 7.887 |
| 0.8048611111111111 | 7.887 |
| 0.8055555555555555 | 7.887 |
| 0.80625 | 7.887 |
| 0.8069444444444445 | 7.887 |
| 0.8076388888888889 | 3.525 |
| 0.8083333333333332 | 3.525 |
| 0.8090277777777778 | 3.525 |
| 0.8097222222222222 | 3.525 |
| 0.8104166666666667 | 3.525 |
| 0.811111111111111 | 3.525 |
| 0.8118055555555556 | 3.525 |
| 0.8125 | 3.525 |
| 0.8131944444444444 | 0 |
| 0.813888888888889 | 0 |
| 0.8145833333333333 | 0 |
| 0.8152777777777778 | 0 |
| 0.8159722222222222 | 0 |
| 0.8166666666666668 | 0 |
| 0.8173611111111111 | 0 |
| 0.8180555555555555 | 0 |
| 0.81875 | 0 |
| 0.8194444444444445 | 0 |
| 0.8201388888888889 | 0 |
| 0.8208333333333333 | 0 |
| 0.8215277777777777 | 0 |
| 0.8222222222222223 | 0 |
| 0.8229166666666666 | 0 |
| 0.8236111111111111 | 0 |
| 0.8243055555555556 | 0 |
| 0.8250000000000001 | 0 |
| 0.8256944444444444 | 0 |
| 0.8263888888888888 | 0 |
| 0.8270833333333334 | 0 |
| 0.8277777777777778 | 0 |
| 0.8284722222222222 | 0 |
| 0.8291666666666666 | 0 |
| 0.8298611111111112 | 0 |
| 0.8305555555555556 | 0 |
| 0.8312499999999999 | 0 |
| 0.8319444444444444 | 0 |
| 0.8326388888888889 | 0 |
| 0.8333333333333334 | 0 |
| 0.8340277777777777 | 0 |
| 0.8347222222222223 | 0 |
| 0.8354166666666667 | 0 |
| 0.8361111111111111 | 0 |
| 0.8368055555555555 | 0 |
| 0.8375 | 0 |
| 0.8381944444444445 | 0 |
| 0.8388888888888889 | 0 |
| 0.8395833333333332 | 0 |
| 0.8402777777777778 | 0 |
| 0.8409722222222222 | 0 |
| 0.8416666666666667 | 0 |
| 0.842361111111111 | 0 |
| 0.8430555555555556 | 0 |
| 0.84375 | 0 |
| 0.8444444444444444 | 0 |
| 0.845138888888889 | 0 |
| 0.8458333333333333 | 0 |
| 0.8465277777777778 | 0 |
| 0.8472222222222222 | 0 |
| 0.8479166666666668 | 0 |
| 0.8486111111111111 | 0 |
| 0.8493055555555555 | 0 |
| 0.85 | 0 |
| 0.8506944444444445 | 0 |
| 0.8513888888888889 | 0 |
| 0.8520833333333333 | 0 |
| 0.8527777777777777 | 0 |
| 0.8534722222222223 | 0 |
| 0.8541666666666666 | 0 |
| 0.8548611111111111 | 0 |
| 0.8555555555555556 | 0 |
| 0.8562500000000001 | 0 |
| 0.8569444444444444 | 0 |
| 0.8576388888888888 | 0 |
| 0.8583333333333334 | 0 |
| 0.8590277777777778 | 0 |
| 0.8597222222222222 | 0 |
| 0.8604166666666666 | 0 |
| 0.8611111111111112 | 0 |
| 0.8618055555555556 | 0 |
| 0.8624999999999999 | 0 |
| 0.8631944444444444 | 0 |
| 0.8638888888888889 | 0 |
| 0.8645833333333334 | 0 |
| 0.8652777777777777 | 0 |
| 0.8659722222222223 | 0 |
| 0.8666666666666667 | 0 |
| 0.8673611111111111 | 0 |
| 0.8680555555555555 | 0 |
| 0.86875 | 0 |
| 0.8694444444444445 | 0 |
| 0.8701388888888889 | 0 |
| 0.8708333333333332 | 0 |
| 0.8715277777777778 | 0 |
| 0.8722222222222222 | 0 |
| 0.8729166666666667 | 0 |
| 0.873611111111111 | 0 |
| 0.8743055555555556 | 0 |
| 0.875 | 0 |
| 0.8756944444444444 | 0 |
| 0.876388888888889 | 0 |
| 0.8770833333333333 | 0 |
| 0.8777777777777778 | 0 |
| 0.8784722222222222 | 0 |
| 0.8791666666666668 | 0 |
| 0.8798611111111111 | 0 |
| 0.8805555555555555 | 0 |
| 0.88125 | 0 |
| 0.8819444444444445 | 0 |
| 0.8826388888888889 | 0 |
| 0.8833333333333333 | 0 |
| 0.8840277777777777 | 0 |
| 0.8847222222222223 | 0 |
| 0.8854166666666666 | 0 |
| 0.8861111111111111 | 0 |
| 0.8868055555555556 | 0 |
| 0.8875000000000001 | 0 |
| 0.8881944444444444 | 0 |
| 0.8888888888888888 | 0 |
| 0.8895833333333334 | 0 |
| 0.8902777777777778 | 0 |
| 0.8909722222222222 | 0 |
| 0.8916666666666666 | 0 |
| 0.8923611111111112 | 0 |
| 0.8930555555555556 | 0 |
| 0.8937499999999999 | 0 |
| 0.8944444444444444 | 0 |
| 0.8951388888888889 | 0 |
| 0.8958333333333334 | 0 |
| 0.8965277777777777 | 0 |
| 0.8972222222222223 | 0 |
| 0.8979166666666667 | 0 |
| 0.8986111111111111 | 0 |
| 0.8993055555555555 | 0 |
| 0.9 | 0 |
| 0.9006944444444445 | 0 |
| 0.9013888888888889 | 0 |
| 0.9020833333333332 | 0 |
| 0.9027777777777778 | 0 |
| 0.9034722222222222 | 0 |
| 0.9041666666666667 | 0 |
| 0.904861111111111 | 0 |
| 0.9055555555555556 | 0 |
| 0.90625 | 0 |
| 0.9069444444444444 | 0 |
| 0.907638888888889 | 0 |
| 0.9083333333333333 | 0 |
| 0.9090277777777778 | 0 |
| 0.9097222222222222 | 0 |
| 0.9104166666666668 | 0 |
| 0.9111111111111111 | 0 |
| 0.9118055555555555 | 0 |
| 0.9125 | 0 |
| 0.9131944444444445 | 0 |
| 0.9138888888888889 | 0 |
| 0.9145833333333333 | 0 |
| 0.9152777777777777 | 0 |
| 0.9159722222222223 | 0 |
| 0.9166666666666666 | 0 |
| 0.9173611111111111 | 0 |
| 0.9180555555555556 | 0 |
| 0.9187500000000001 | 0 |
| 0.9194444444444444 | 0 |
| 0.9201388888888888 | 0 |
| 0.9208333333333334 | 0 |
| 0.9215277777777778 | 0 |
| 0.9222222222222222 | 0 |
| 0.9229166666666666 | 0 |
| 0.9236111111111112 | 0 |
| 0.9243055555555556 | 0 |
| 0.9249999999999999 | 0 |
| 0.9256944444444444 | 0 |
| 0.9263888888888889 | 0 |
| 0.9270833333333334 | 0 |
| 0.9277777777777777 | 0 |
| 0.9284722222222223 | 0 |
| 0.9291666666666667 | 0 |
| 0.9298611111111111 | 0 |
| 0.9305555555555555 | 0 |
| 0.93125 | 0 |
| 0.9319444444444445 | 0 |
| 0.9326388888888889 | 0 |
| 0.9333333333333332 | 0 |
| 0.9340277777777778 | 0 |
| 0.9347222222222222 | 0 |
| 0.9354166666666667 | 0 |
| 0.936111111111111 | 0 |
| 0.9368055555555556 | 0 |
| 0.9375 | 0 |
| 0.9381944444444444 | 0 |
| 0.938888888888889 | 0 |
| 0.9395833333333333 | 0 |
| 0.9402777777777778 | 0 |
| 0.9409722222222222 | 0 |
| 0.9416666666666668 | 0 |
| 0.9423611111111111 | 0 |
| 0.9430555555555555 | 0 |
| 0.94375 | 0 |
| 0.9444444444444445 | 0 |
| 0.9451388888888889 | 0 |
| 0.9458333333333333 | 0 |
| 0.9465277777777777 | 0 |
| 0.9472222222222223 | 0 |
| 0.9479166666666666 | 0 |
| 0.9486111111111111 | 0 |
| 0.9493055555555556 | 0 |
| 0.9500000000000001 | 0 |
| 0.9506944444444444 | 0 |
| 0.9513888888888888 | 0 |
| 0.9520833333333334 | 0 |
| 0.9527777777777778 | 0 |
| 0.9534722222222222 | 0 |
| 0.9541666666666666 | 0 |
| 0.9548611111111112 | 0 |
| 0.9555555555555556 | 0 |
| 0.9562499999999999 | 0 |
| 0.9569444444444444 | 0 |
| 0.9576388888888889 | 0 |
| 0.9583333333333334 | 0 |
| 0.9590277777777777 | 0 |
| 0.9597222222222223 | 0 |
| 0.9604166666666667 | 0 |
| 0.9611111111111111 | 0 |
| 0.9618055555555555 | 0 |
| 0.9625 | 0 |
| 0.9631944444444445 | 0 |
| 0.9638888888888889 | 0 |
| 0.9645833333333332 | 0 |
| 0.9652777777777778 | 0 |
| 0.9659722222222222 | 0 |
| 0.9666666666666667 | 0 |
| 0.967361111111111 | 0 |
| 0.9680555555555556 | 0 |
| 0.96875 | 0 |
| 0.9694444444444444 | 0 |
| 0.970138888888889 | 0 |
| 0.9708333333333333 | 0 |
| 0.9715277777777778 | 0 |
| 0.9722222222222222 | 0 |
| 0.9729166666666668 | 0 |
| 0.9736111111111111 | 0 |
| 0.9743055555555555 | 0 |
| 0.975 | 0 |
| 0.9756944444444445 | 0 |
| 0.9763888888888889 | 0 |
| 0.9770833333333333 | 0 |
| 0.9777777777777777 | 0 |
| 0.9784722222222223 | 0 |
| 0.9791666666666666 | 0 |
| 0.9798611111111111 | 0 |
| 0.9805555555555556 | 0 |
| 0.9812500000000001 | 0 |
| 0.9819444444444444 | 0 |
| 0.9826388888888888 | 0 |
| 0.9833333333333334 | 0 |
| 0.9840277777777778 | 0 |
| 0.9847222222222222 | 0 |
| 0.9854166666666666 | 0 |
| 0.9861111111111112 | 0 |
| 0.9868055555555556 | 0 |
| 0.9874999999999999 | 0 |
| 0.9881944444444444 | 0 |
| 0.9888888888888889 | 0 |
| 0.9895833333333334 | 0 |
| 0.9902777777777777 | 0 |
| 0.9909722222222223 | 0 |
| 0.9916666666666667 | 0 |
| 0.9923611111111111 | 0 |
| 0.9930555555555555 | 0 |
| 0.99375 | 0 |
| 0.9944444444444445 | 0 |
| 0.9951388888888889 | 0 |
| 0.9958333333333332 | 0 |
| 0.9965277777777778 | 0 |
| 0.9972222222222222 | 0 |
| 0.9979166666666667 | 0 |
| 0.998611111111111 | 0 |
| 0.9993055555555556 | 0 |